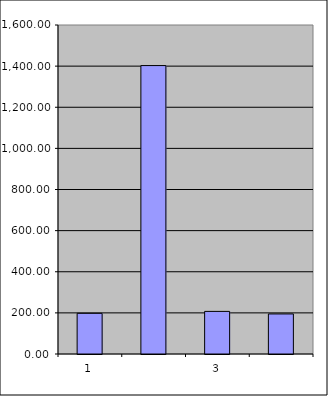
| Category | Series 0 |
|---|---|
| 0 | 197.75 |
| 1 | 1402.666 |
| 2 | 207.205 |
| 3 | 194.764 |